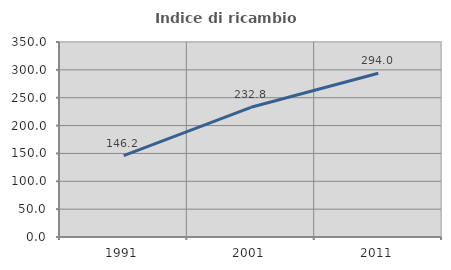
| Category | Indice di ricambio occupazionale  |
|---|---|
| 1991.0 | 146.196 |
| 2001.0 | 232.796 |
| 2011.0 | 294.013 |